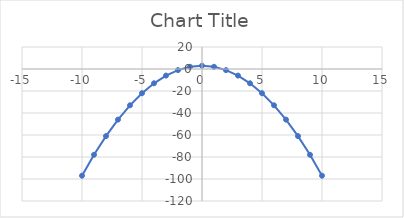
| Category | Series 0 |
|---|---|
| -10.0 | -97 |
| -9.0 | -78 |
| -8.0 | -61 |
| -7.0 | -46 |
| -6.0 | -33 |
| -5.0 | -22 |
| -4.0 | -13 |
| -3.0 | -6 |
| -2.0 | -1 |
| -1.0 | 2 |
| 0.0 | 3 |
| 1.0 | 2 |
| 2.0 | -1 |
| 3.0 | -6 |
| 4.0 | -13 |
| 5.0 | -22 |
| 6.0 | -33 |
| 7.0 | -46 |
| 8.0 | -61 |
| 9.0 | -78 |
| 10.0 | -97 |